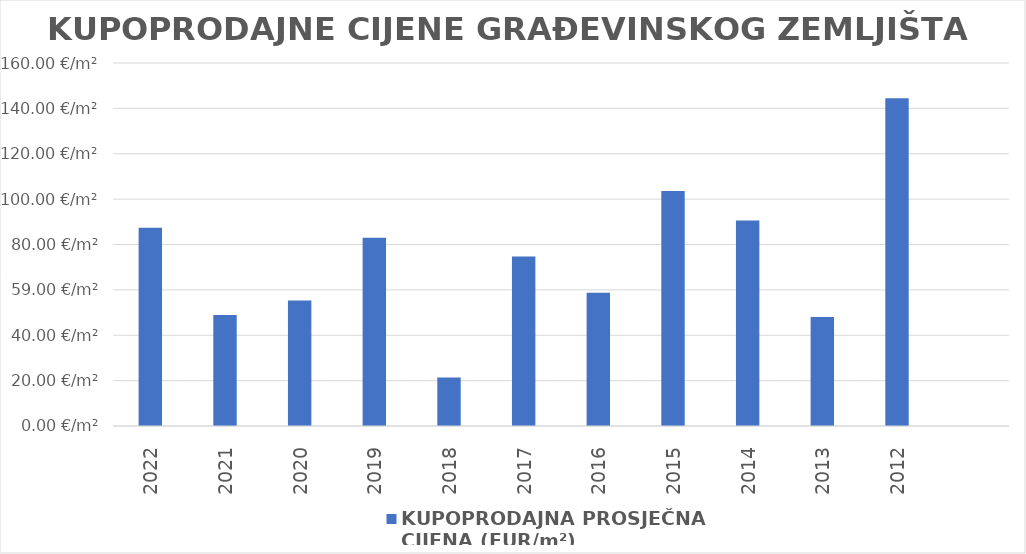
| Category | KUPOPRODAJNA PROSJEČNA 
CIJENA (EUR/m²) |
|---|---|
| 2022 | 1900-03-27 08:20:01 |
| 2021 | 1900-02-17 22:05:43 |
| 2020 | 1900-02-24 07:27:28 |
| 2019 | 1900-03-22 23:17:55 |
| 2018 | 1900-01-21 08:30:26 |
| 2017 | 1900-03-14 18:08:27 |
| 2016 | 1900-02-27 16:56:03 |
| 2015 | 1900-04-12 13:26:43 |
| 2014 | 1900-03-30 13:06:58 |
| 2013 | 1900-02-17 00:33:06 |
| 2012 | 1900-05-23 10:44:32 |